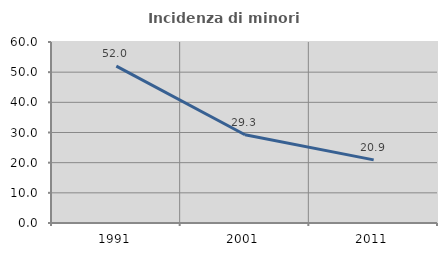
| Category | Incidenza di minori stranieri |
|---|---|
| 1991.0 | 52 |
| 2001.0 | 29.268 |
| 2011.0 | 20.93 |